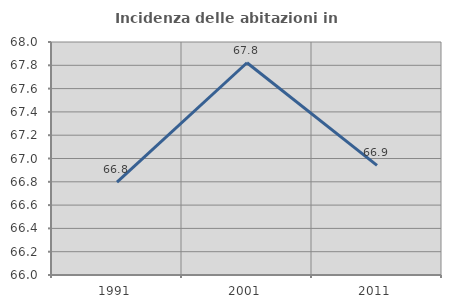
| Category | Incidenza delle abitazioni in proprietà  |
|---|---|
| 1991.0 | 66.797 |
| 2001.0 | 67.822 |
| 2011.0 | 66.941 |